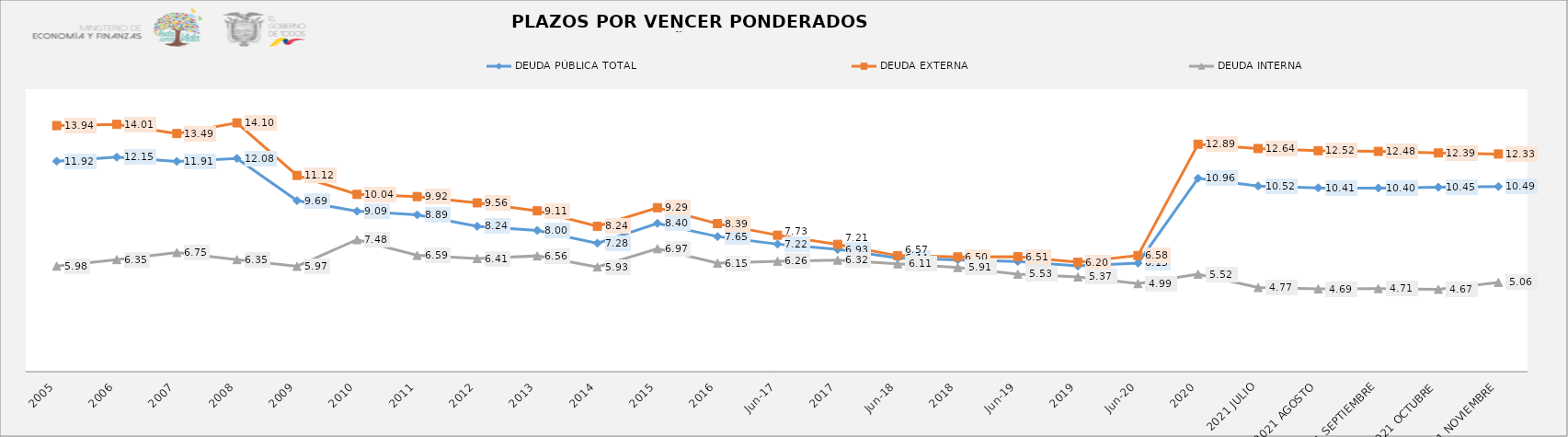
| Category | DEUDA PÚBLICA TOTAL | DEUDA EXTERNA  | DEUDA INTERNA |
|---|---|---|---|
| 2005 | 11.92 | 13.939 | 5.98 |
| 2006 | 12.15 | 14.01 | 6.35 |
| 2007 | 11.91 | 13.489 | 6.75 |
| 2008 | 12.08 | 14.097 | 6.35 |
| 2009 | 9.69 | 11.12 | 5.97 |
| 2010 | 9.09 | 10.045 | 7.48 |
| 2011 | 8.889 | 9.918 | 6.59 |
| 2012 | 8.237 | 9.564 | 6.41 |
| 2013 | 8.003 | 9.112 | 6.56 |
| 2014 | 7.278 | 8.241 | 5.93 |
| 2015 | 8.401 | 9.29 | 6.969 |
| 2016 | 7.655 | 8.385 | 6.149 |
| jun-17 | 7.224 | 7.733 | 6.257 |
| 2017 | 6.927 | 7.21 | 6.32 |
| jun-18 | 6.439 | 6.574 | 6.111 |
| 2018 | 6.337 | 6.503 | 5.906 |
| jun-19 | 6.246 | 6.509 | 5.526 |
| 2019 | 5.988 | 6.201 | 5.368 |
| jun-20 | 6.152 | 6.581 | 4.989 |
| 2020 | 10.957 | 12.887 | 5.519 |
| 2021 JULIO | 10.52 | 12.64 | 4.77 |
| 2021 AGOSTO | 10.414 | 12.52 | 4.69 |
| 2021 SEPTIEMBRE | 10.4 | 12.48 | 4.71 |
| 2021 OCTUBRE | 10.45 | 12.39 | 4.67 |
| 2021 NOVIEMBRE | 10.49 | 12.33 | 5.06 |